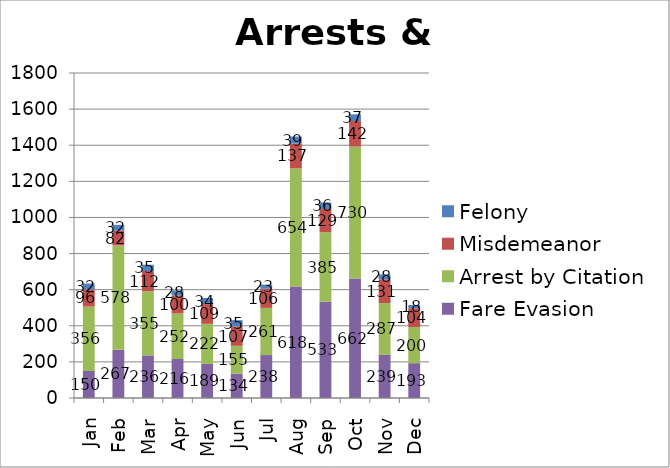
| Category | Fare Evasion | Arrest by Citation | Misdemeanor | Felony |
|---|---|---|---|---|
| Jan | 150 | 356 | 96 | 32 |
| Feb | 267 | 578 | 82 | 32 |
| Mar | 236 | 355 | 112 | 35 |
| Apr | 216 | 252 | 100 | 28 |
| May | 189 | 222 | 109 | 34 |
| Jun | 134 | 155 | 107 | 35 |
| Jul | 238 | 261 | 106 | 23 |
| Aug | 618 | 654 | 137 | 39 |
| Sep | 533 | 385 | 129 | 36 |
| Oct | 662 | 730 | 142 | 37 |
| Nov | 239 | 287 | 131 | 28 |
| Dec | 193 | 200 | 104 | 18 |